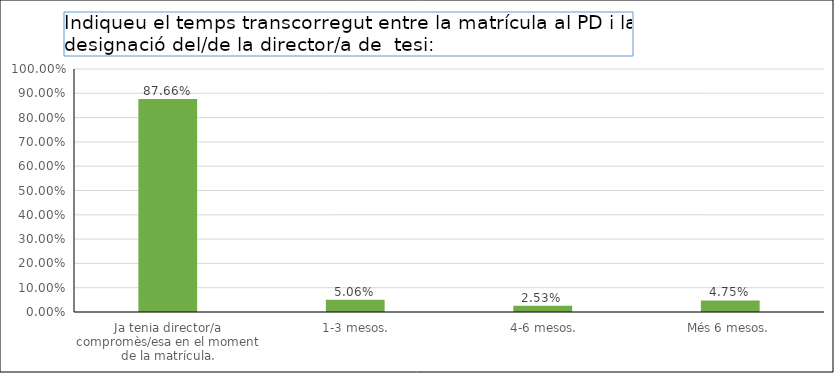
| Category | Series 0 |
|---|---|
| Ja tenia director/a compromès/esa en el moment de la matrícula. | 0.877 |
|  1-3 mesos. | 0.051 |
|  4-6 mesos. | 0.025 |
| Més 6 mesos. | 0.048 |